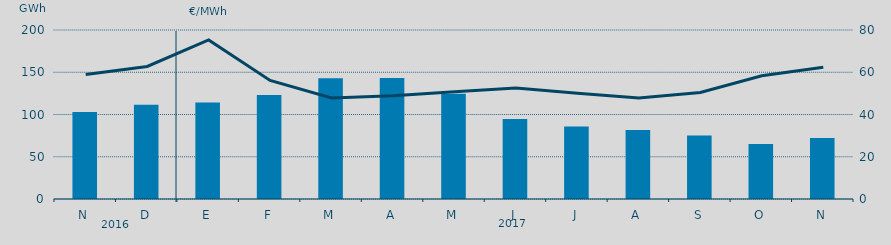
| Category | Energía a subir |
|---|---|
| N | 103079.487 |
| D | 111652.906 |
| E | 114098.605 |
| F | 123063.594 |
| M | 142874.975 |
| A | 143332.881 |
| M | 124663.514 |
| J | 94559.541 |
| J | 85673.202 |
| A | 81536.076 |
| S | 75102.289 |
| O | 65089.595 |
| N | 72290.07 |